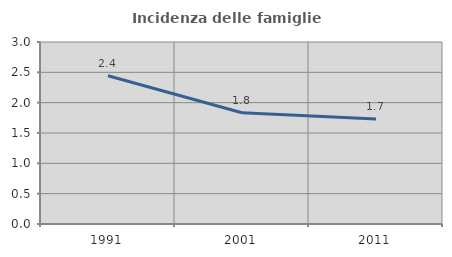
| Category | Incidenza delle famiglie numerose |
|---|---|
| 1991.0 | 2.444 |
| 2001.0 | 1.835 |
| 2011.0 | 1.733 |